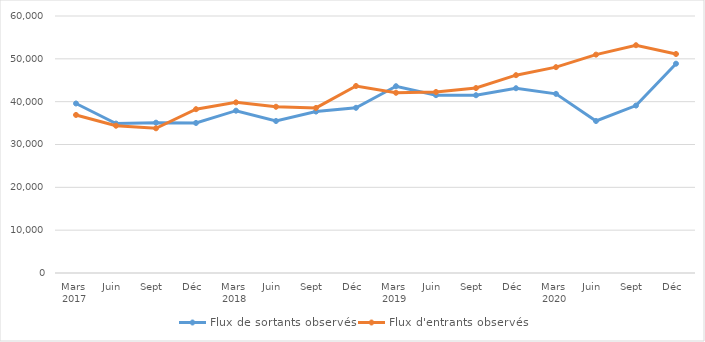
| Category | Flux de sortants observés | Flux d'entrants observés |
|---|---|---|
| 0 | 39575 | 36901 |
| 1 | 34886 | 34387 |
| 2 | 35096 | 33784 |
| 3 | 35030 | 38243 |
| 4 | 37894 | 39834 |
| 5 | 35485 | 38812 |
| 6 | 37688 | 38537 |
| 7 | 38568 | 43660 |
| 8 | 43607 | 42076 |
| 9 | 41520 | 42262 |
| 10 | 41499 | 43179 |
| 11 | 43135 | 46186 |
| 12 | 41822 | 48059 |
| 13 | 35485 | 50984 |
| 14 | 39094 | 53178 |
| 15 | 48866 | 51129 |